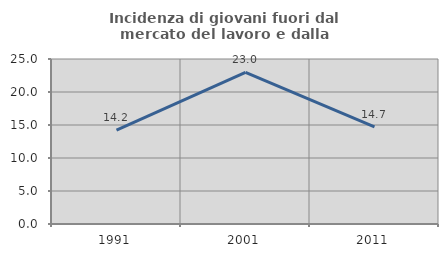
| Category | Incidenza di giovani fuori dal mercato del lavoro e dalla formazione  |
|---|---|
| 1991.0 | 14.223 |
| 2001.0 | 22.965 |
| 2011.0 | 14.726 |